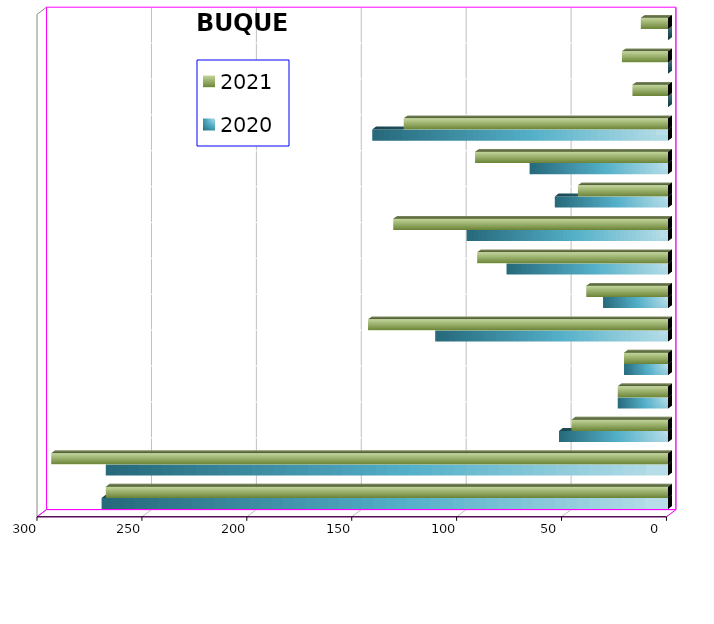
| Category | 2020 | 2021 |
|---|---|---|
| ICAVE | 270 | 268 |
| CICE | 268 | 294 |
| T. C. E. | 52 | 46 |
| CARGILL | 24 | 24 |
| TMV | 21 | 21 |
| SSA | 111 | 143 |
| SEPSA | 31 | 39 |
| VOPAK | 77 | 91 |
| CPV | 96 | 131 |
| EXCELLENCE | 54 | 43 |
| SIPPB | 66 | 92 |
| PEMEX | 141 | 126 |
| PETRA | 0 | 17 |
| OPEVER | 0 | 22 |
| ESJ ERNOVABLE III | 0 | 13 |